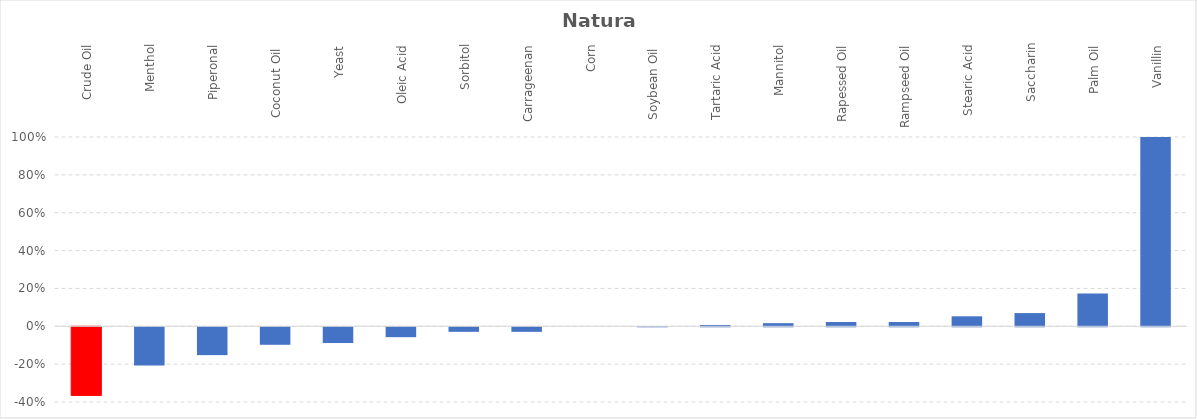
| Category | Series 0 |
|---|---|
| Crude Oil | -0.362 |
| Menthol | -0.202 |
| Piperonal | -0.147 |
| Coconut Oil  | -0.092 |
| Yeast | -0.083 |
| Oleic Acid | -0.052 |
| Sorbitol | -0.024 |
| Carrageenan | -0.024 |
| Corn | 0 |
| Soybean Oil  | 0.001 |
| Tartaric Acid | 0.007 |
| Mannitol | 0.016 |
| Rapessed Oil | 0.022 |
| Rampseed Oil | 0.022 |
| Stearic Acid | 0.053 |
| Saccharin | 0.07 |
| Palm Oil | 0.173 |
| Vanillin | 1.028 |